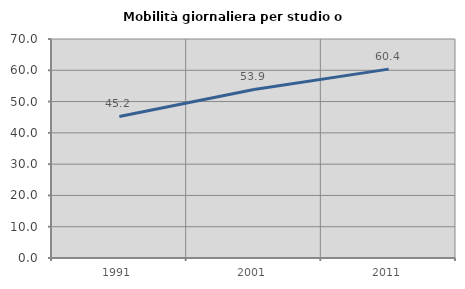
| Category | Mobilità giornaliera per studio o lavoro |
|---|---|
| 1991.0 | 45.23 |
| 2001.0 | 53.872 |
| 2011.0 | 60.366 |